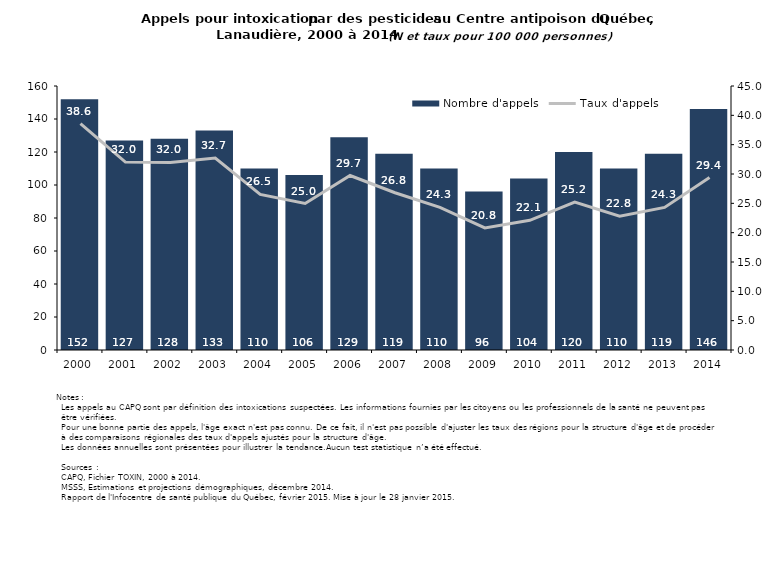
| Category | Nombre d'appels |
|---|---|
| 2000.0 | 152 |
| 2001.0 | 127 |
| 2002.0 | 128 |
| 2003.0 | 133 |
| 2004.0 | 110 |
| 2005.0 | 106 |
| 2006.0 | 129 |
| 2007.0 | 119 |
| 2008.0 | 110 |
| 2009.0 | 96 |
| 2010.0 | 104 |
| 2011.0 | 120 |
| 2012.0 | 110 |
| 2013.0 | 119 |
| 2014.0 | 146 |